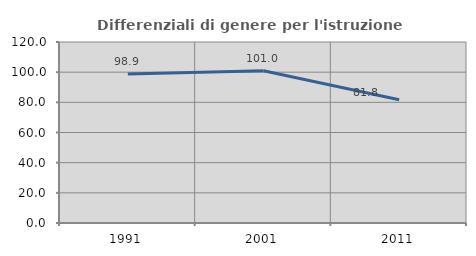
| Category | Differenziali di genere per l'istruzione superiore |
|---|---|
| 1991.0 | 98.864 |
| 2001.0 | 100.981 |
| 2011.0 | 81.766 |